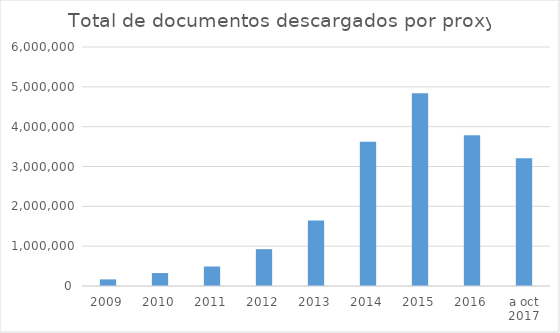
| Category | Series 0 |
|---|---|
| 2009 | 166028 |
| 2010 | 324806 |
| 2011 | 489717 |
| 2012 | 924956 |
| 2013 | 1642050 |
| 2014 | 3618653 |
| 2015 | 4838486 |
| 2016 | 3782331 |
| a oct 2017 | 3206516 |